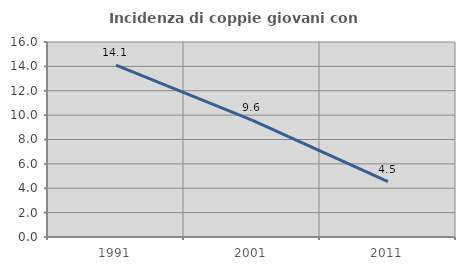
| Category | Incidenza di coppie giovani con figli |
|---|---|
| 1991.0 | 14.103 |
| 2001.0 | 9.589 |
| 2011.0 | 4.545 |